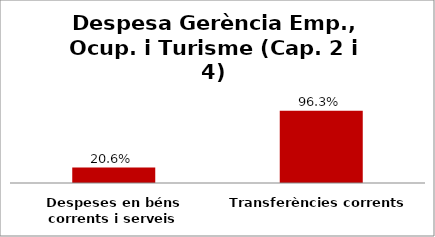
| Category | Series 0 |
|---|---|
| Despeses en béns corrents i serveis | 0.206 |
| Transferències corrents | 0.963 |